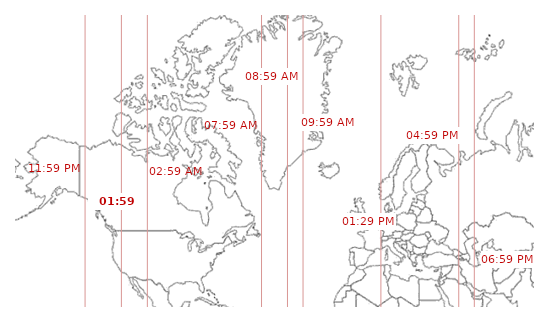
| Category | Dummy |
|---|---|
| 1.35 | 0 |
| 2.05 | 0 |
| 2.55 | 0 |
| 4.75 | 0 |
| 5.25 | 0 |
| 5.55 | 0 |
| 7.05 | 0 |
| 8.55 | 0 |
| 8.85 | 0 |